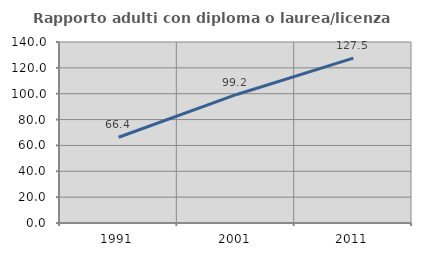
| Category | Rapporto adulti con diploma o laurea/licenza media  |
|---|---|
| 1991.0 | 66.351 |
| 2001.0 | 99.231 |
| 2011.0 | 127.509 |